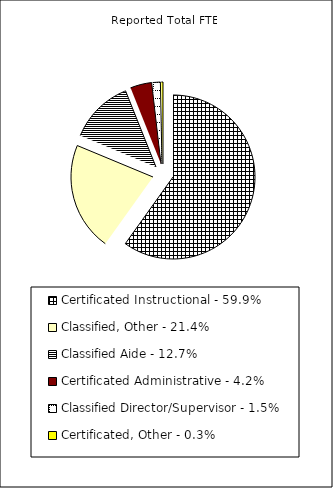
| Category | Reported FTE |
|---|---|
| Certificated Instructional - 59.9% | 74141.16 |
| Classified, Other - 21.4% | 26474.28 |
| Classified Aide - 12.7% | 15697.75 |
| Certificated Administrative - 4.2% | 5240.21 |
| Classified Director/Supervisor - 1.5% | 1866.88 |
| Certificated, Other - 0.3% | 389.77 |